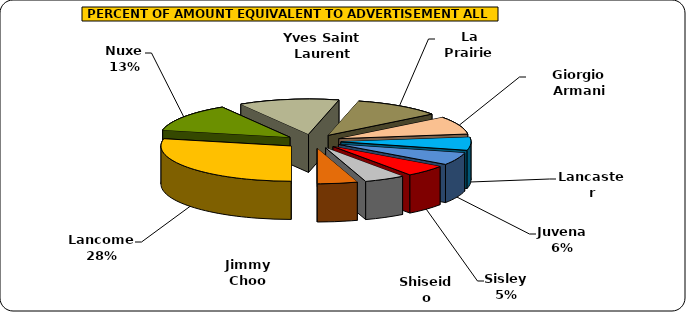
| Category | Series 0 |
|---|---|
| Lancome | 594179.615 |
| Nuxe | 272460.769 |
| Yves Saint Laurent | 261700.385 |
| La Prairie | 229505.769 |
| Giorgio Armani | 172326.923 |
| Lancaster | 125509.615 |
| Juvena | 120417.308 |
| Sisley | 111473.077 |
| Shiseido | 106909.615 |
| Jimmy Choo | 104496.538 |